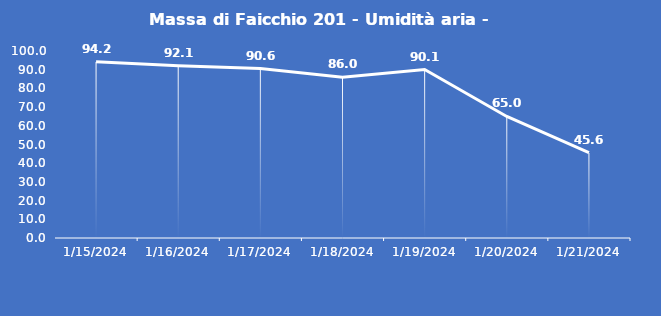
| Category | Massa di Faicchio 201 - Umidità aria - Grezzo (%) |
|---|---|
| 1/15/24 | 94.2 |
| 1/16/24 | 92.1 |
| 1/17/24 | 90.6 |
| 1/18/24 | 86 |
| 1/19/24 | 90.1 |
| 1/20/24 | 65 |
| 1/21/24 | 45.6 |